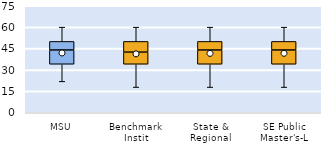
| Category | 25th | 50th | 75th |
|---|---|---|---|
| MSU | 34 | 10 | 6 |
| Benchmark Instit | 34 | 8.5 | 7.5 |
| State & Regional | 34 | 10 | 6 |
| SE Public Master's-L | 34 | 10 | 6 |